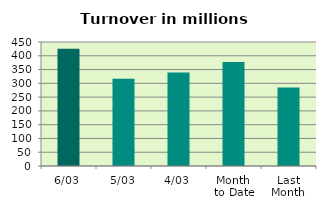
| Category | Series 0 |
|---|---|
| 6/03 | 425.225 |
| 5/03 | 316.77 |
| 4/03 | 339.159 |
| Month 
to Date | 377.138 |
| Last
Month | 285.08 |